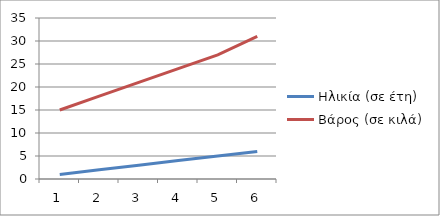
| Category | Ηλικία (σε έτη) | Βάρος (σε κιλά) |
|---|---|---|
| 0 | 1 | 15 |
| 1 | 2 | 18 |
| 2 | 3 | 21 |
| 3 | 4 | 24 |
| 4 | 5 | 27 |
| 5 | 6 | 31 |